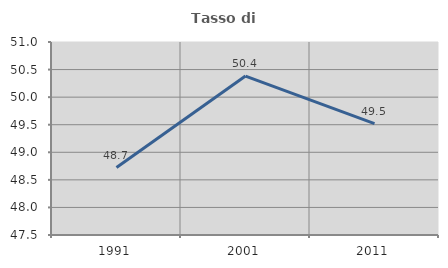
| Category | Tasso di occupazione   |
|---|---|
| 1991.0 | 48.724 |
| 2001.0 | 50.382 |
| 2011.0 | 49.52 |